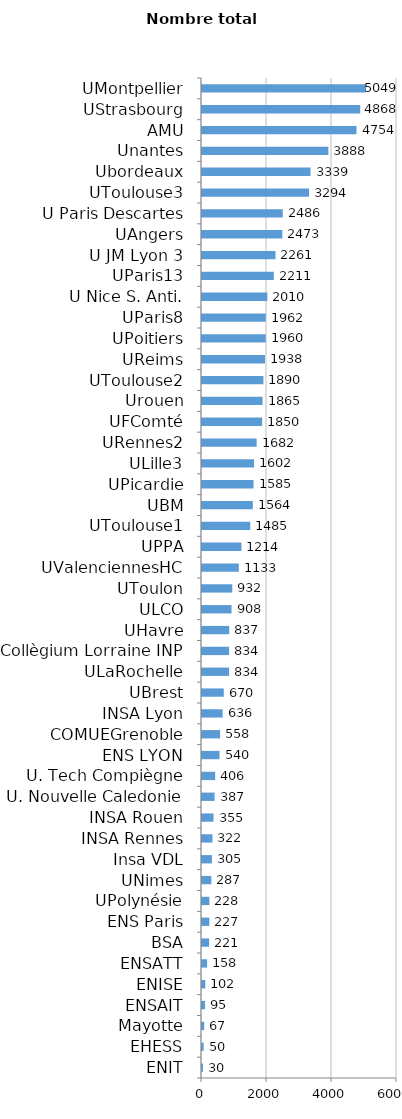
| Category | Nombre total vacataires |
|---|---|
| ENIT | 30 |
| EHESS | 50 |
| Mayotte | 67 |
| ENSAIT | 95 |
| ENISE | 102 |
| ENSATT | 158 |
| BSA | 221 |
| ENS Paris | 227 |
| UPolynésie | 228 |
| UNimes | 287 |
| Insa VDL | 305 |
| INSA Rennes | 322 |
| INSA Rouen | 355 |
| U. Nouvelle Caledonie | 387 |
| U. Tech Compiègne | 406 |
| ENS LYON | 540 |
| COMUEGrenoble | 558 |
| INSA Lyon | 636 |
| UBrest | 670 |
| ULaRochelle | 834 |
| Collègium Lorraine INP | 834 |
| UHavre | 837 |
| ULCO | 908 |
| UToulon | 932 |
| UValenciennesHC | 1133 |
| UPPA | 1214 |
| UToulouse1 | 1485 |
| UBM | 1564 |
| UPicardie | 1585 |
| ULille3 | 1602 |
| URennes2 | 1682 |
| UFComté | 1850 |
| Urouen | 1865 |
| UToulouse2 | 1890 |
| UReims | 1938 |
| UPoitiers | 1960 |
| UParis8 | 1962 |
| U Nice S. Anti. | 2010 |
| UParis13 | 2211 |
| U JM Lyon 3 | 2261 |
| UAngers | 2473 |
| U Paris Descartes | 2486 |
| UToulouse3 | 3294 |
| Ubordeaux | 3339 |
| Unantes | 3888 |
| AMU | 4754 |
| UStrasbourg | 4868 |
| UMontpellier | 5049 |